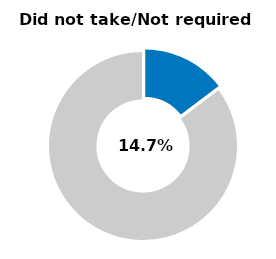
| Category | Series 0 |
|---|---|
| Did not take/not required | 0.147 |
| Other | 0.853 |